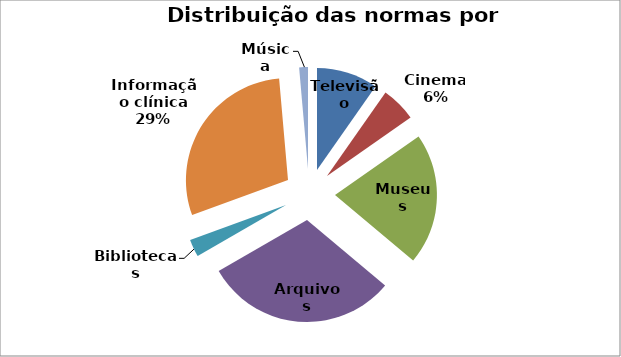
| Category | Series 0 |
|---|---|
| Televisão | 7 |
| Cinema | 4 |
| Museus | 15 |
| Arquivos | 22 |
| Bibliotecas | 2 |
| Informação clínica | 21 |
| Música | 1 |